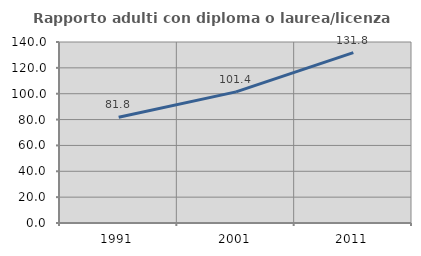
| Category | Rapporto adulti con diploma o laurea/licenza media  |
|---|---|
| 1991.0 | 81.818 |
| 2001.0 | 101.406 |
| 2011.0 | 131.76 |